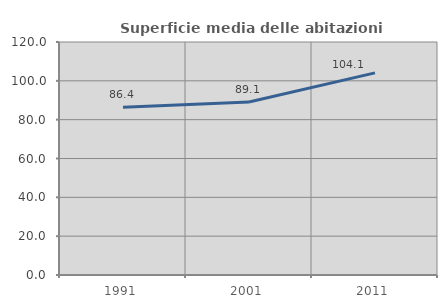
| Category | Superficie media delle abitazioni occupate |
|---|---|
| 1991.0 | 86.391 |
| 2001.0 | 89.09 |
| 2011.0 | 104.09 |